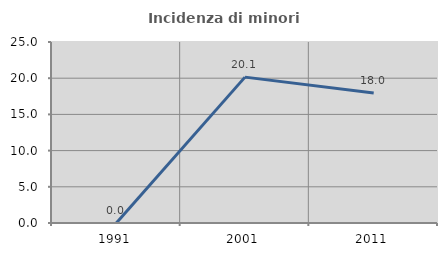
| Category | Incidenza di minori stranieri |
|---|---|
| 1991.0 | 0 |
| 2001.0 | 20.149 |
| 2011.0 | 17.956 |